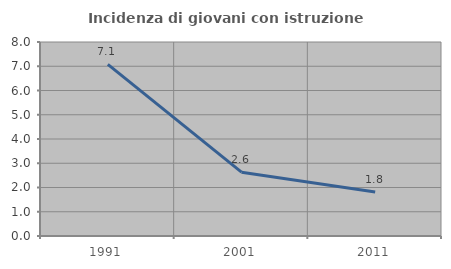
| Category | Incidenza di giovani con istruzione universitaria |
|---|---|
| 1991.0 | 7.08 |
| 2001.0 | 2.632 |
| 2011.0 | 1.818 |